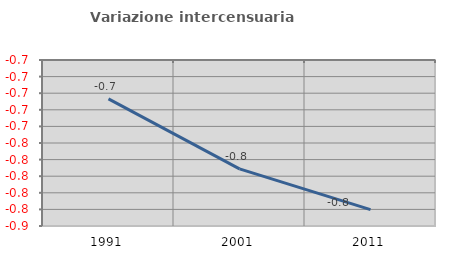
| Category | Variazione intercensuaria annua |
|---|---|
| 1991.0 | -0.707 |
| 2001.0 | -0.791 |
| 2011.0 | -0.84 |